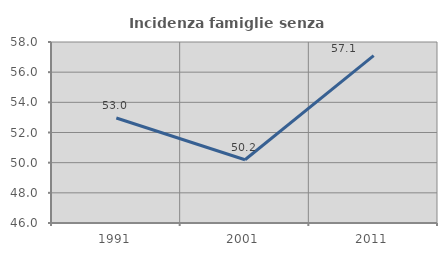
| Category | Incidenza famiglie senza nuclei |
|---|---|
| 1991.0 | 52.962 |
| 2001.0 | 50.195 |
| 2011.0 | 57.092 |